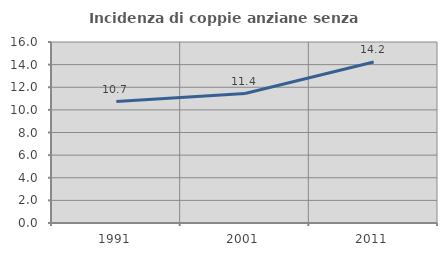
| Category | Incidenza di coppie anziane senza figli  |
|---|---|
| 1991.0 | 10.737 |
| 2001.0 | 11.447 |
| 2011.0 | 14.225 |